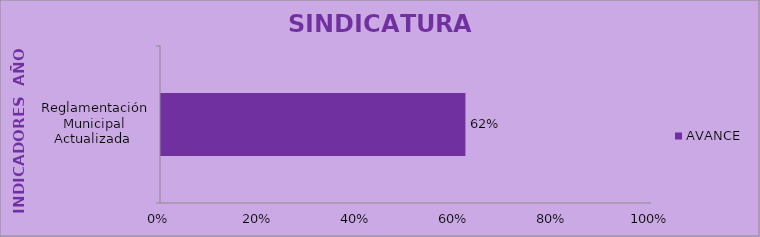
| Category | AVANCE |
|---|---|
| Reglamentación Municipal Actualizada  | 0.62 |